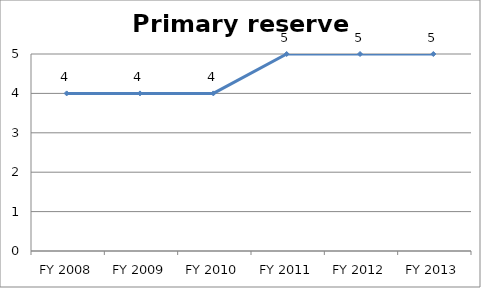
| Category | Primary reserve score |
|---|---|
| FY 2013 | 5 |
| FY 2012 | 5 |
| FY 2011 | 5 |
| FY 2010 | 4 |
| FY 2009 | 4 |
| FY 2008 | 4 |